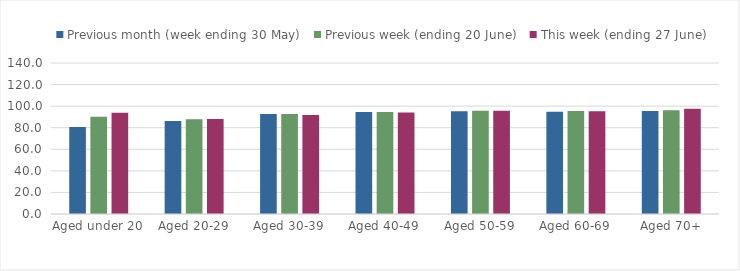
| Category | Previous month (week ending 30 May) | Previous week (ending 20 June) | This week (ending 27 June) |
|---|---|---|---|
| Aged under 20 | 80.654 | 90.204 | 93.851 |
| Aged 20-29 | 86.205 | 87.869 | 88.022 |
| Aged 30-39 | 92.697 | 92.751 | 91.795 |
| Aged 40-49 | 94.668 | 94.661 | 94.037 |
| Aged 50-59 | 95.297 | 95.801 | 95.695 |
| Aged 60-69 | 94.845 | 95.493 | 95.258 |
| Aged 70+ | 95.479 | 96.258 | 97.515 |